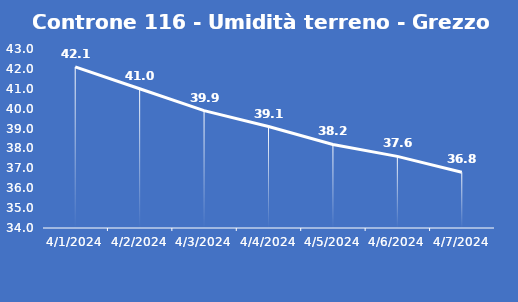
| Category | Controne 116 - Umidità terreno - Grezzo (%VWC) |
|---|---|
| 4/1/24 | 42.1 |
| 4/2/24 | 41 |
| 4/3/24 | 39.9 |
| 4/4/24 | 39.1 |
| 4/5/24 | 38.2 |
| 4/6/24 | 37.6 |
| 4/7/24 | 36.8 |